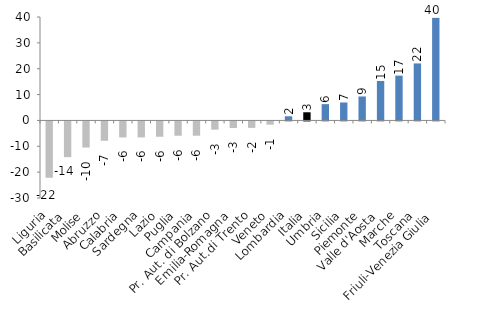
| Category | Series 0 |
|---|---|
| Liguria | -21.789 |
| Basilicata | -13.814 |
| Molise | -10.093 |
| Abruzzo | -7.487 |
| Calabria | -6.197 |
| Sardegna | -6.171 |
| Lazio | -5.928 |
| Puglia | -5.531 |
| Campania | -5.519 |
| Pr. Aut. di Bolzano | -3.181 |
| Emilia-Romagna | -2.543 |
| Pr. Aut.di Trento | -2.488 |
| Veneto | -1.245 |
| Lombardia | 1.605 |
| Italia | 3.155 |
| Umbria | 6.297 |
| Sicilia | 6.943 |
| Piemonte | 9.27 |
| Valle d'Aosta | 15.267 |
| Marche | 17.326 |
| Toscana | 22.045 |
| Friuli-Venezia Giulia | 39.669 |